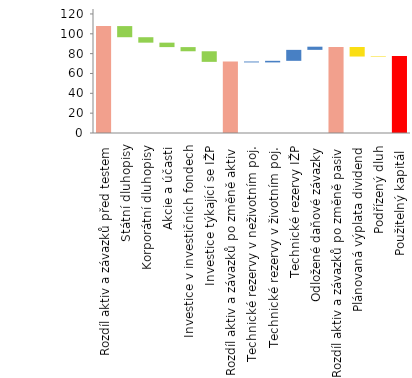
| Category | Series 0 | Series 1 |
|---|---|---|
| Rozdíl aktiv a závazků před testem | 107.78 | 0 |
| Státní dluhopisy | 96.55 | 11.23 |
| Korporátní dluhopisy | 91.07 | 5.48 |
| Akcie a účasti | 86.59 | 4.49 |
| Investice v investičních fondech | 82.4 | 4.19 |
| Investice týkající se IŽP | 71.71 | 10.68 |
| Rozdíl aktiv a závazků po změně aktiv | 0 | 72.07 |
| Technické rezervy v neživotním poj. | 71.15 | 0.92 |
| Technické rezervy v životním poj. | 71.15 | 1.61 |
| Technické rezervy IŽP | 72.75 | 11.05 |
| Odložené daňové závazky | 83.81 | 3.19 |
| Rozdíl aktiv a závazků po změně pasiv | 0 | 86.72 |
| Plánovaná výplata dividend | 77.09 | 9.63 |
| Podřízený dluh | 77.09 | 0.56 |
| Použitelný kapitál  | 0 | 77.69 |